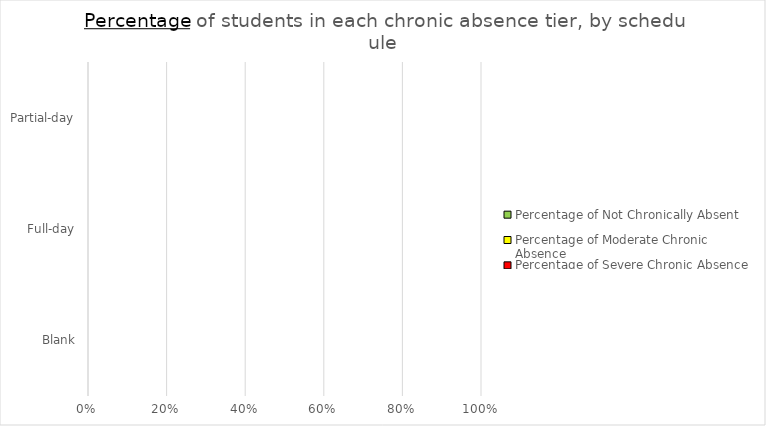
| Category | Percentage of Not Chronically Absent | Percentage of Moderate Chronic Absence | Percentage of Severe Chronic Absence |
|---|---|---|---|
| Blank | 0 | 0 | 0 |
| Full-day | 0 | 0 | 0 |
| Partial-day | 0 | 0 | 0 |